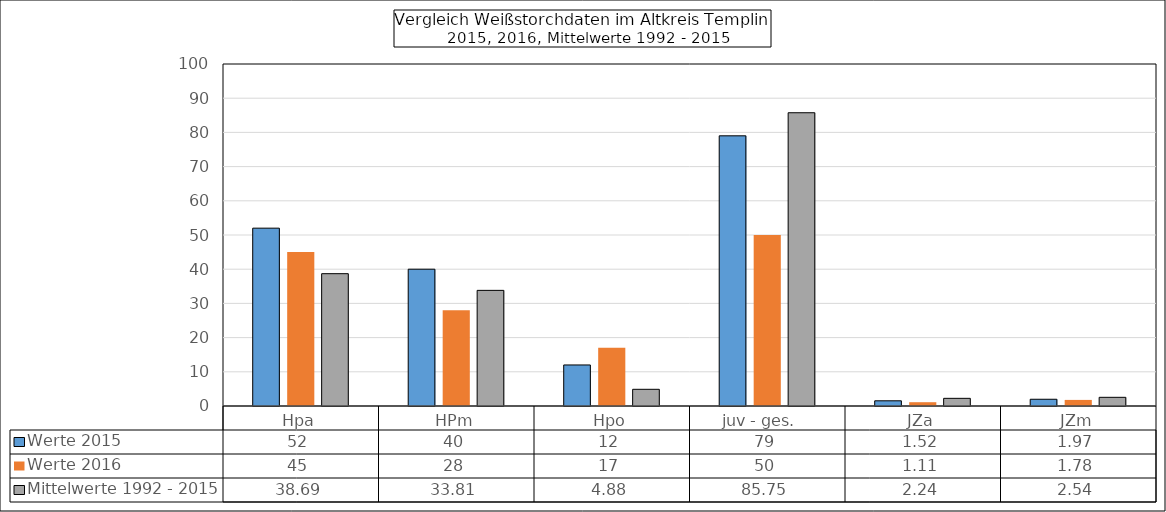
| Category | Werte 2015 | Werte 2016 | Mittelwerte 1992 - 2015 |
|---|---|---|---|
| Hpa | 52 | 45 | 38.69 |
| HPm | 40 | 28 | 33.81 |
| Hpo | 12 | 17 | 4.88 |
| juv - ges.   | 79 | 50 | 85.75 |
| JZa | 1.52 | 1.111 | 2.24 |
| JZm | 1.97 | 1.78 | 2.54 |